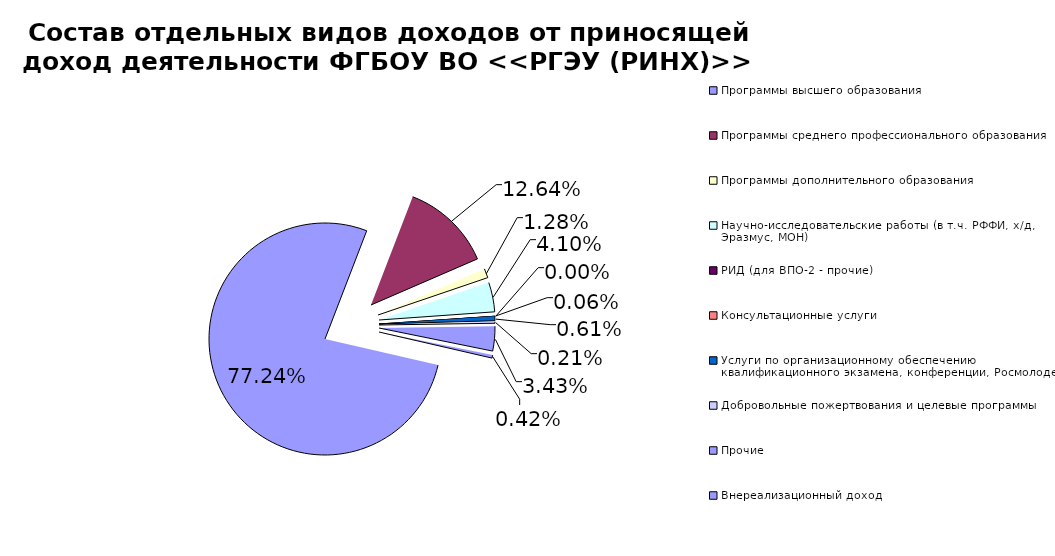
| Category | Series 0 |
|---|---|
| Программы высшего образования | 0.772 |
| Программы среднего профессионального образования | 0.126 |
| Программы дополнительного образования | 0.013 |
| Научно-исследовательские работы (в т.ч. РФФИ, х/д, Эразмус, МОН) | 0.041 |
| РИД (для ВПО-2 - прочие) | 0.001 |
| Консультационные услуги   | 0 |
| Услуги по организационному обеспечению квалификационного экзамена, конференции, Росмолодежь | 0.006 |
| Добровольные пожертвования и целевые программы | 0.002 |
| Прочие | 0.034 |
| Внереализационный доход  | 0.004 |